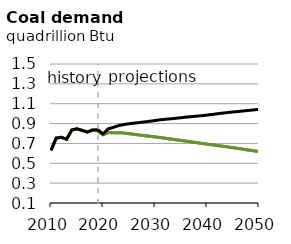
| Category | EAC | DAC | Reference |
|---|---|---|---|
| 2010.0 | 0.629 | 0.629 | 0.629 |
| 2011.0 | 0.754 | 0.754 | 0.754 |
| 2012.0 | 0.762 | 0.762 | 0.762 |
| 2013.0 | 0.742 | 0.742 | 0.742 |
| 2014.0 | 0.836 | 0.836 | 0.836 |
| 2015.0 | 0.847 | 0.847 | 0.847 |
| 2016.0 | 0.831 | 0.831 | 0.831 |
| 2017.0 | 0.814 | 0.814 | 0.814 |
| 2018.0 | 0.836 | 0.836 | 0.836 |
| 2019.0 | 0.825 | 0.825 | 0.838 |
| 2020.0 | 0.787 | 0.787 | 0.796 |
| 2021.0 | 0.809 | 0.809 | 0.847 |
| 2022.0 | 0.808 | 0.808 | 0.862 |
| 2023.0 | 0.809 | 0.809 | 0.88 |
| 2024.0 | 0.804 | 0.804 | 0.89 |
| 2025.0 | 0.798 | 0.798 | 0.898 |
| 2026.0 | 0.792 | 0.792 | 0.904 |
| 2027.0 | 0.785 | 0.785 | 0.91 |
| 2028.0 | 0.778 | 0.778 | 0.917 |
| 2029.0 | 0.772 | 0.772 | 0.924 |
| 2030.0 | 0.766 | 0.766 | 0.93 |
| 2031.0 | 0.76 | 0.76 | 0.938 |
| 2032.0 | 0.752 | 0.752 | 0.943 |
| 2033.0 | 0.744 | 0.744 | 0.948 |
| 2034.0 | 0.737 | 0.737 | 0.953 |
| 2035.0 | 0.73 | 0.73 | 0.959 |
| 2036.0 | 0.723 | 0.723 | 0.965 |
| 2037.0 | 0.716 | 0.715 | 0.97 |
| 2038.0 | 0.708 | 0.708 | 0.975 |
| 2039.0 | 0.7 | 0.7 | 0.98 |
| 2040.0 | 0.693 | 0.693 | 0.986 |
| 2041.0 | 0.686 | 0.686 | 0.992 |
| 2042.0 | 0.679 | 0.679 | 0.999 |
| 2043.0 | 0.672 | 0.672 | 1.005 |
| 2044.0 | 0.665 | 0.665 | 1.011 |
| 2045.0 | 0.657 | 0.657 | 1.017 |
| 2046.0 | 0.649 | 0.649 | 1.022 |
| 2047.0 | 0.641 | 0.641 | 1.027 |
| 2048.0 | 0.633 | 0.633 | 1.032 |
| 2049.0 | 0.625 | 0.625 | 1.038 |
| 2050.0 | 0.618 | 0.618 | 1.044 |